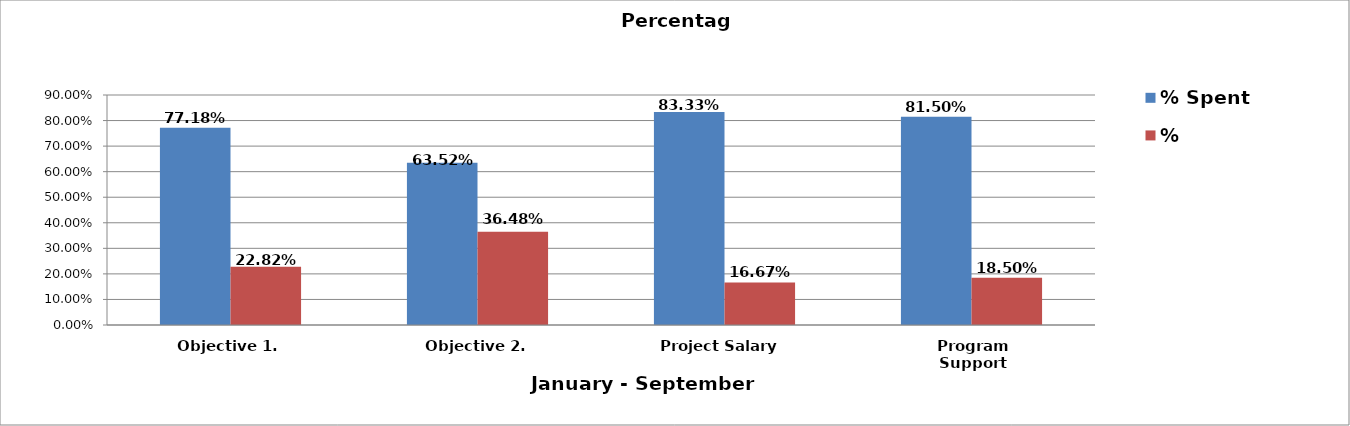
| Category | % Spent  | % Balance  |
|---|---|---|
| Objective 1. | 0.772 | 0.228 |
| Objective 2. | 0.635 | 0.365 |
| Project Salary  | 0.833 | 0.167 |
| Program Support | 0.815 | 0.185 |